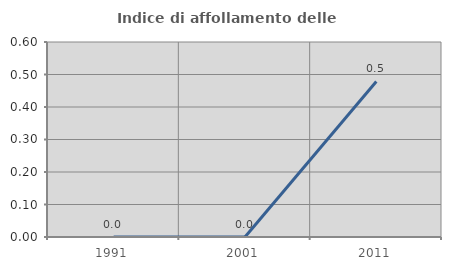
| Category | Indice di affollamento delle abitazioni  |
|---|---|
| 1991.0 | 0 |
| 2001.0 | 0 |
| 2011.0 | 0.478 |